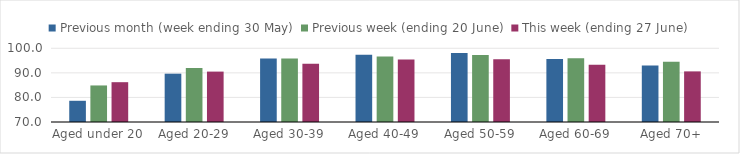
| Category | Previous month (week ending 30 May) | Previous week (ending 20 June) | This week (ending 27 June) |
|---|---|---|---|
| Aged under 20 | 78.636 | 84.875 | 86.204 |
| Aged 20-29 | 89.669 | 91.964 | 90.512 |
| Aged 30-39 | 95.835 | 95.793 | 93.672 |
| Aged 40-49 | 97.361 | 96.669 | 95.459 |
| Aged 50-59 | 98.132 | 97.23 | 95.513 |
| Aged 60-69 | 95.59 | 95.932 | 93.287 |
| Aged 70+ | 92.945 | 94.479 | 90.598 |